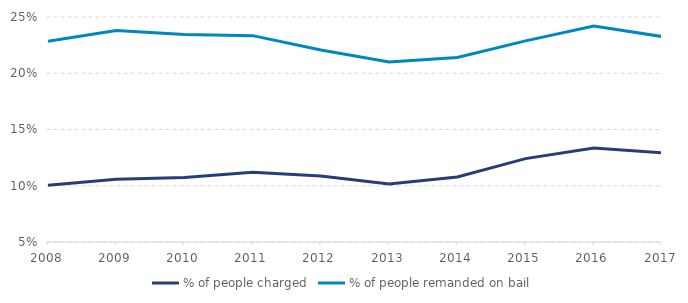
| Category | % of people charged | % of people remanded on bail |
|---|---|---|
| 2008.0 | 0.1 | 0.228 |
| 2009.0 | 0.106 | 0.238 |
| 2010.0 | 0.107 | 0.234 |
| 2011.0 | 0.112 | 0.233 |
| 2012.0 | 0.109 | 0.221 |
| 2013.0 | 0.102 | 0.21 |
| 2014.0 | 0.108 | 0.214 |
| 2015.0 | 0.124 | 0.229 |
| 2016.0 | 0.134 | 0.242 |
| 2017.0 | 0.129 | 0.233 |